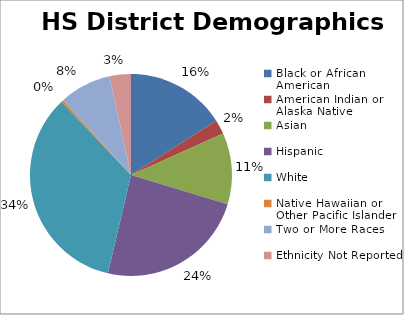
| Category | Series 0 |
|---|---|
| Black or African American | 0.16 |
| American Indian or Alaska Native | 0.023 |
| Asian | 0.114 |
| Hispanic | 0.24 |
| White | 0.343 |
| Native Hawaiian or Other Pacific Islander | 0.004 |
| Two or More Races | 0.083 |
| Ethnicity Not Reported | 0.034 |